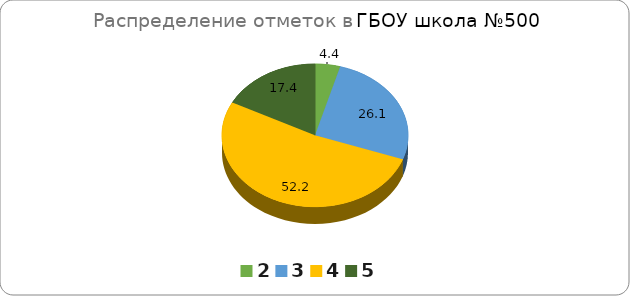
| Category | ГБОУ СОШ №500 |
|---|---|
| 2.0 | 4.35 |
| 3.0 | 26.09 |
| 4.0 | 52.17 |
| 5.0 | 17.39 |